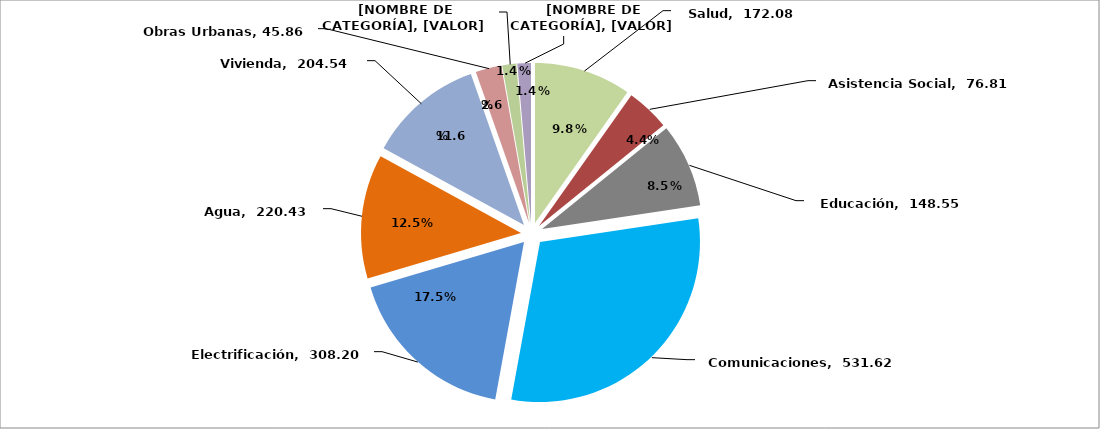
| Category | Series 0 |
|---|---|
| Salud | 172.082 |
| Asistencia Social | 76.814 |
| Educación | 148.55 |
| Comunicaciones | 531.618 |
| Electrificación | 308.203 |
| Agua | 220.432 |
| Vivienda | 204.544 |
| Obras Urbanas | 45.856 |
| Deporte | 24.86 |
| Cultura | 23.99 |